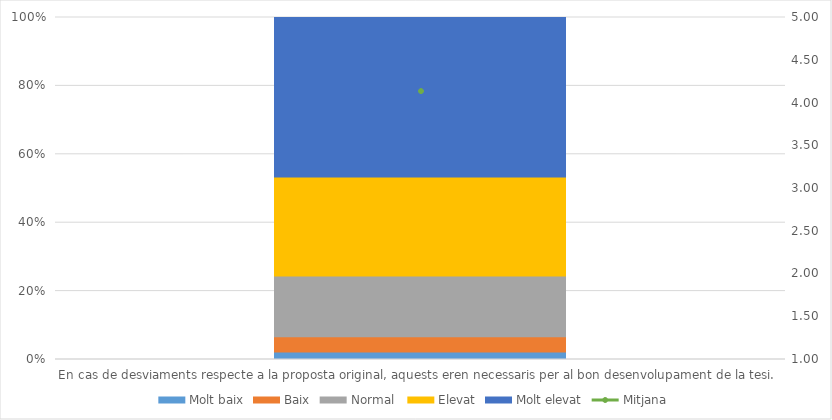
| Category | Molt baix | Baix | Normal  | Elevat | Molt elevat |
|---|---|---|---|---|---|
| En cas de desviaments respecte a la proposta original, aquests eren necessaris per al bon desenvolupament de la tesi. | 1 | 2 | 8 | 13 | 21 |